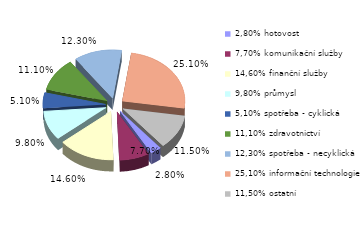
| Category | Series 0 |
|---|---|
| 2,80% hotovost | 0.028 |
| 7,70% komunikační služby | 0.077 |
| 14,60% finanční služby | 0.146 |
| 9,80% průmysl | 0.098 |
| 5,10% spotřeba - cyklická | 0.051 |
| 11,10% zdravotnictví | 0.111 |
| 12,30% spotřeba - necyklická | 0.123 |
| 25,10% informační technologie | 0.251 |
| 11,50% ostatní | 0.115 |